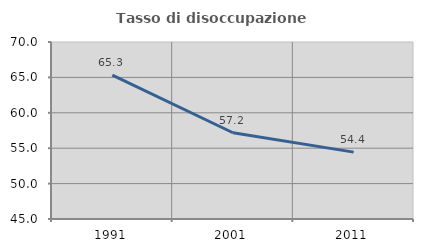
| Category | Tasso di disoccupazione giovanile  |
|---|---|
| 1991.0 | 65.331 |
| 2001.0 | 57.181 |
| 2011.0 | 54.444 |